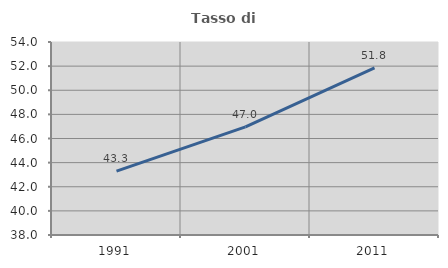
| Category | Tasso di occupazione   |
|---|---|
| 1991.0 | 43.296 |
| 2001.0 | 46.957 |
| 2011.0 | 51.849 |